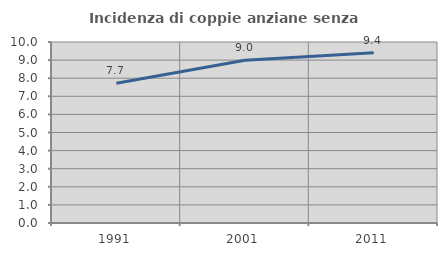
| Category | Incidenza di coppie anziane senza figli  |
|---|---|
| 1991.0 | 7.721 |
| 2001.0 | 8.994 |
| 2011.0 | 9.411 |